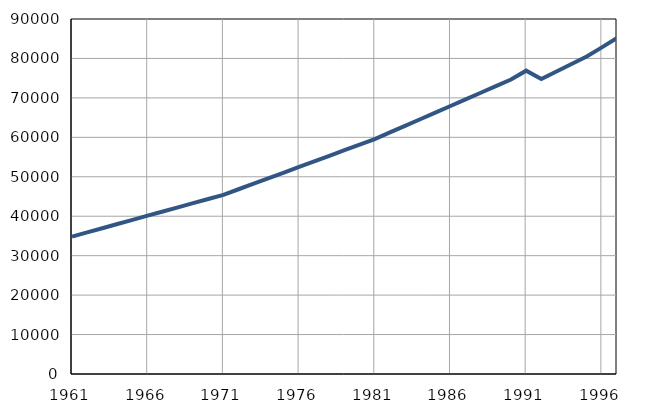
| Category | Population
size |
|---|---|
| 1961.0 | 34844 |
| 1962.0 | 35902 |
| 1963.0 | 36960 |
| 1964.0 | 38018 |
| 1965.0 | 39076 |
| 1966.0 | 40134 |
| 1967.0 | 41192 |
| 1968.0 | 42250 |
| 1969.0 | 43308 |
| 1970.0 | 44366 |
| 1971.0 | 45424 |
| 1972.0 | 46838 |
| 1973.0 | 48252 |
| 1974.0 | 49666 |
| 1975.0 | 51080 |
| 1976.0 | 52494 |
| 1977.0 | 53908 |
| 1978.0 | 55322 |
| 1979.0 | 56736 |
| 1980.0 | 58150 |
| 1981.0 | 59567 |
| 1982.0 | 61243 |
| 1983.0 | 62919 |
| 1984.0 | 64595 |
| 1985.0 | 66271 |
| 1986.0 | 67947 |
| 1987.0 | 69623 |
| 1988.0 | 71299 |
| 1989.0 | 72975 |
| 1990.0 | 74651 |
| 1991.0 | 76900 |
| 1992.0 | 74800 |
| 1993.0 | 76700 |
| 1994.0 | 78600 |
| 1995.0 | 80500 |
| 1996.0 | 82800 |
| 1997.0 | 85200 |